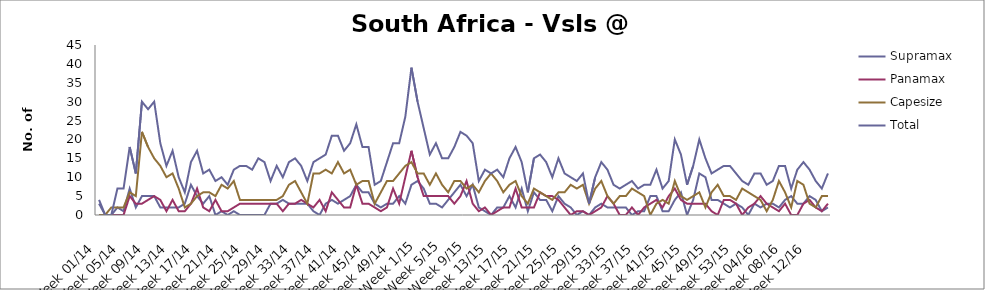
| Category | Supramax | Panamax | Capesize | Total |
|---|---|---|---|---|
| Week 01/14 | 3 | 0 | 0 | 4 |
| Week 02/14 | 0 | 0 | 0 | 0 |
| Week 03/14 | 0 | 0 | 2 | 0 |
| Week 04/14 | 2 | 0 | 2 | 7 |
| Week 05/14 | 1 | 0 | 2 | 7 |
| Week 06/14 | 7 | 5 | 6 | 18 |
| Week 07/14 | 2 | 3 | 5 | 11 |
| Week 08/14 | 5 | 3 | 22 | 30 |
| Week 09/14 | 5 | 4 | 18 | 28 |
| Week 10/14 | 5 | 5 | 15 | 30 |
| Week 11/14 | 2 | 4 | 13 | 19 |
| Week 12/14 | 2 | 1 | 10 | 13 |
| Week 13/14 | 2 | 4 | 11 | 17 |
| Week 14/14 | 2 | 1 | 7 | 10 |
| Week 15/14 | 3 | 1 | 2 | 6 |
| Week 16/14 | 8 | 3 | 3 | 14 |
| Week 17/14 | 5 | 7 | 5 | 17 |
| Week 18/14 | 3 | 2 | 6 | 11 |
| Week 19/14 | 5 | 1 | 6 | 12 |
| Week 20/14 | 0 | 4 | 5 | 9 |
| Week 21/14 | 1 | 1 | 8 | 10 |
| Week 22/14 | 0 | 1 | 7 | 8 |
| Week 23/14 | 1 | 2 | 9 | 12 |
| Week 24/14 | 0 | 3 | 4 | 13 |
| Week 25/14 | 0 | 3 | 4 | 13 |
| Week 26/14 | 0 | 3 | 4 | 12 |
| Week 27/14 | 0 | 3 | 4 | 15 |
| Week 28/14 | 0 | 3 | 4 | 14 |
| Week 29/14 | 3 | 3 | 4 | 9 |
| Week 30/14 | 3 | 3 | 4 | 13 |
| Week 31/14 | 4 | 1 | 5 | 10 |
| Week 32/14 | 3 | 3 | 8 | 14 |
| Week 33/14 | 3 | 3 | 9 | 15 |
| Week 34/14 | 3 | 4 | 6 | 13 |
| Week 35/14 | 3 | 3 | 3 | 9 |
| Week 36/14 | 1 | 2 | 11 | 14 |
| Week 37/14 | 0 | 4 | 11 | 15 |
| Week 38/14 | 3 | 1 | 12 | 16 |
| Week 39/14 | 4 | 6 | 11 | 21 |
| Week 40/14 | 3 | 4 | 14 | 21 |
| Week 41/14 | 4 | 2 | 11 | 17 |
| Week 42/14 | 5 | 2 | 12 | 19 |
| Week 43/14 | 8 | 8 | 8 | 24 |
| Week 44/14 | 6 | 3 | 9 | 18 |
| Week 45/14 | 6 | 3 | 9 | 18 |
| Week 46/14 | 3 | 2 | 3 | 8 |
| Week 47/14 | 2 | 1 | 6 | 9 |
| Week 48/14 | 3 | 2 | 9 | 14 |
| Week 49/14 | 3 | 7 | 9 | 19 |
| Week 50/14 | 5 | 3 | 11 | 19 |
| Week 51/14 | 3 | 10 | 13 | 26 |
| Week 52/14 | 8 | 17 | 14 | 39 |
| Week 1/15 | 9 | 10 | 11 | 30 |
| Week 2/15 | 7 | 5 | 11 | 23 |
| Week 3/15 | 3 | 5 | 8 | 16 |
| Week 4/15 | 3 | 5 | 11 | 19 |
| Week 5/15 | 2 | 5 | 8 | 15 |
| Week 6/15 | 4 | 5 | 6 | 15 |
| Week 7/15 | 6 | 3 | 9 | 18 |
| Week 8/15 | 8 | 5 | 9 | 22 |
| Week 9/15 | 5 | 9 | 7 | 21 |
| Week 10/15 | 8 | 3 | 8 | 19 |
| Week 11/15 | 2 | 1 | 6 | 9 |
| Week 12/15 | 1 | 2 | 9 | 12 |
| Week 13/15 | 0 | 0 | 11 | 11 |
| Week 14/15 | 2 | 1 | 9 | 12 |
| Week 15/15 | 2 | 2 | 6 | 10 |
| Week 16/15 | 5 | 2 | 8 | 15 |
| Week 17/15 | 2 | 7 | 9 | 18 |
| Week 18/15 | 7 | 2 | 5 | 14 |
| Week 19/15 | 1 | 2 | 3 | 6 |
| Week 20/15 | 6 | 2 | 7 | 15 |
| Week 21/15 | 4 | 6 | 6 | 16 |
| Week 22/15 | 4 | 5 | 5 | 14 |
| Week 23/15 | 1 | 5 | 4 | 10 |
| Week 24/15 | 5 | 4 | 6 | 15 |
| Week 25/15 | 3 | 2 | 6 | 11 |
| Week 26/15 | 2 | 0 | 8 | 10 |
| Week 27/15 | 0 | 1 | 7 | 9 |
| Week 28/15 | 1 | 1 | 8 | 11 |
| Week 29/15 | 0 | 0 | 3 | 3 |
| Week 30/15 | 2 | 1 | 7 | 10 |
| Week 31/15 | 3 | 2 | 9 | 14 |
| Week 32/15 | 2 | 5 | 5 | 12 |
| Week 33/15 | 2 | 3 | 3 | 8 |
| Week 34/15 | 2 | 0 | 5 | 7 |
| Week 35/15 | 2 | 0 | 5 | 8 |
| Week 36/15 | 0 | 2 | 7 | 9 |
| Week 37/15 | 1 | 0 | 6 | 7 |
| Week 38/15 | 1 | 2 | 5 | 8 |
| Week 39/15 | 5 | 3 | 0 | 8 |
| Week 40/15 | 5 | 4 | 3 | 12 |
| Week 41/15 | 1 | 2 | 4 | 7 |
| Week 42/15 | 1 | 5 | 3 | 9 |
| Week 43/15 | 4 | 7 | 9 | 20 |
| Week 44/15 | 6 | 4 | 5 | 16 |
| Week 45/15 | 0 | 3 | 4 | 8 |
| Week 46/15 | 4 | 3 | 5 | 13 |
| Week 47/15 | 11 | 3 | 6 | 20 |
| Week 48/15 | 10 | 3 | 2 | 15 |
| Week 49/15 | 4 | 1 | 6 | 11 |
| Week 50/15 | 4 | 0 | 8 | 12 |
| Week 51/15 | 3 | 4 | 5 | 13 |
| Week 52/15 | 2 | 4 | 5 | 13 |
| Week 53/15 | 3 | 3 | 4 | 11 |
| Week 01/16 | 2 | 0 | 7 | 9 |
| Week 02/16 | 0 | 2 | 6 | 8 |
| Week 03/16 | 3 | 3 | 5 | 11 |
| Week 04/16 | 2 | 5 | 4 | 11 |
| Week 05/16 | 3 | 3 | 1 | 8 |
| Week 06/16 | 3 | 2 | 4 | 9 |
| Week 07/16 | 2 | 1 | 9 | 13 |
| Week 08/16 | 4 | 3 | 6 | 13 |
| Week 09/16 | 5 | 0 | 2 | 7 |
| Week 10/16 | 3 | 0 | 9 | 12 |
| Week 11/16 | 3 | 3 | 8 | 14 |
| Week 12/16 | 5 | 4 | 3 | 12 |
| Week 13/16 | 4 | 2 | 2 | 9 |
| Week 14/16 | 1 | 1 | 5 | 7 |